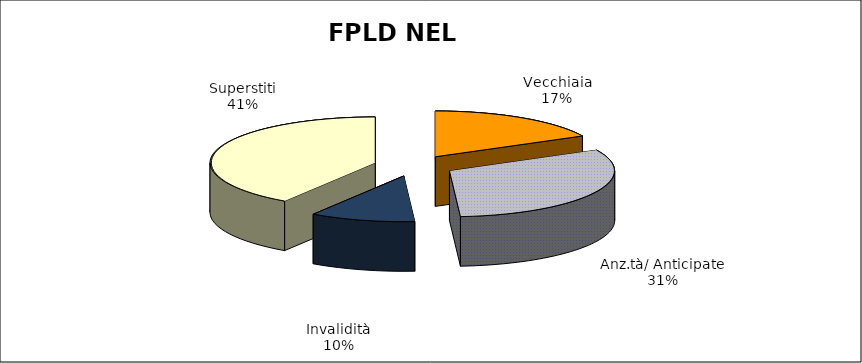
| Category | Series 0 |
|---|---|
| Vecchiaia | 49297 |
| Anz.tà/ Anticipate | 88743 |
| Invalidità | 29053 |
| Superstiti | 114961 |